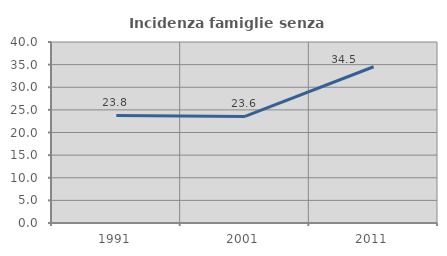
| Category | Incidenza famiglie senza nuclei |
|---|---|
| 1991.0 | 23.768 |
| 2001.0 | 23.556 |
| 2011.0 | 34.525 |